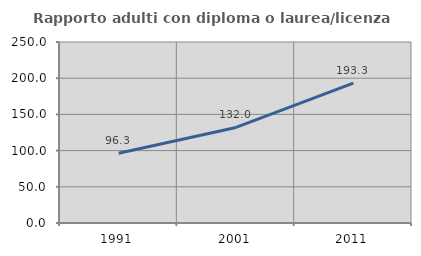
| Category | Rapporto adulti con diploma o laurea/licenza media  |
|---|---|
| 1991.0 | 96.327 |
| 2001.0 | 132.013 |
| 2011.0 | 193.269 |